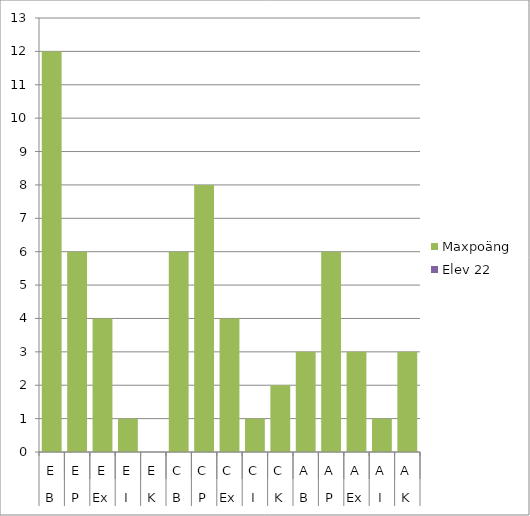
| Category | Maxpoäng | Elev 22 |
|---|---|---|
| 0 | 12 | 0 |
| 1 | 6 | 0 |
| 2 | 4 | 0 |
| 3 | 1 | 0 |
| 4 | 0 | 0 |
| 5 | 6 | 0 |
| 6 | 8 | 0 |
| 7 | 4 | 0 |
| 8 | 1 | 0 |
| 9 | 2 | 0 |
| 10 | 3 | 0 |
| 11 | 6 | 0 |
| 12 | 3 | 0 |
| 13 | 1 | 0 |
| 14 | 3 | 0 |